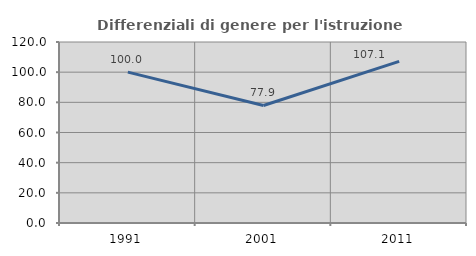
| Category | Differenziali di genere per l'istruzione superiore |
|---|---|
| 1991.0 | 100.037 |
| 2001.0 | 77.909 |
| 2011.0 | 107.147 |